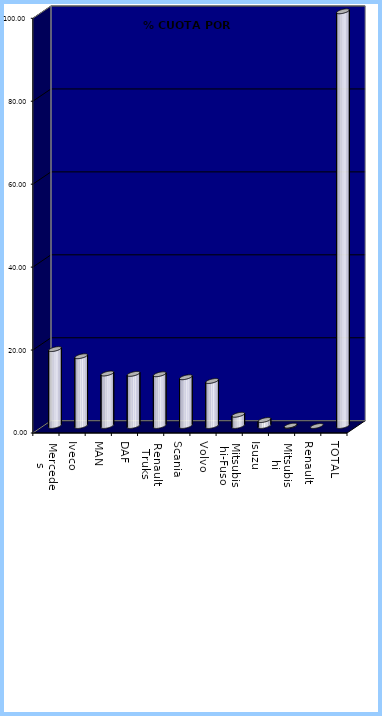
| Category | Series 0 |
|---|---|
| Mercedes | 18.55 |
| Iveco | 16.83 |
| MAN | 12.66 |
| DAF | 12.57 |
| Renault Truks | 12.48 |
| Scania | 11.76 |
| Volvo | 10.85 |
| Mitsubishi-Fuso | 2.71 |
| Isuzu | 1.44 |
| Mitsubishi | 0.09 |
| Renault | 0 |
| TOTAL | 100 |